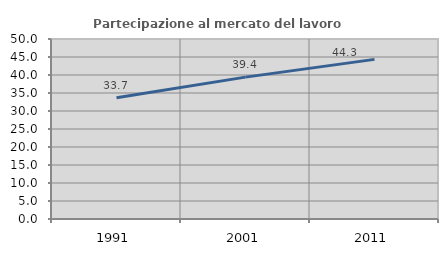
| Category | Partecipazione al mercato del lavoro  femminile |
|---|---|
| 1991.0 | 33.701 |
| 2001.0 | 39.408 |
| 2011.0 | 44.341 |